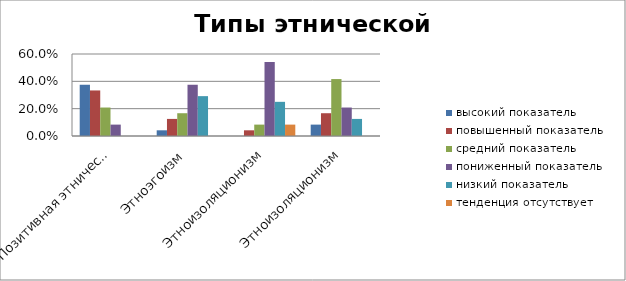
| Category | высокий показатель | повышенный показатель | средний показатель | пониженный показатель | низкий показатель | тенденция отсутствует |
|---|---|---|---|---|---|---|
| Позитивная этническая идентичность | 0.375 | 0.333 | 0.208 | 0.083 | 0 | 0 |
| Этноэгоизм | 0.042 | 0.125 | 0.167 | 0.375 | 0.292 | 0 |
| Этноизоляционизм | 0 | 0.042 | 0.083 | 0.542 | 0.25 | 0.083 |
| Этноизоляционизм | 0.083 | 0.167 | 0.417 | 0.208 | 0.125 | 0 |